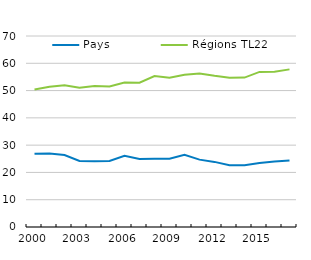
| Category | Pays | Régions TL22 |
|---|---|---|
| 2000.0 | 26.817 | 50.398 |
| 2001.0 | 26.947 | 51.413 |
| 2002.0 | 26.353 | 51.987 |
| 2003.0 | 24.17 | 51.062 |
| 2004.0 | 24.091 | 51.653 |
| 2005.0 | 24.175 | 51.518 |
| 2006.0 | 26.076 | 52.953 |
| 2007.0 | 24.936 | 52.872 |
| 2008.0 | 24.971 | 55.344 |
| 2009.0 | 25.018 | 54.701 |
| 2010.0 | 26.502 | 55.82 |
| 2011.0 | 24.689 | 56.273 |
| 2012.0 | 23.862 | 55.411 |
| 2013.0 | 22.643 | 54.733 |
| 2014.0 | 22.658 | 54.758 |
| 2015.0 | 23.422 | 56.844 |
| 2016.0 | 24.042 | 56.935 |
| 2017.0 | 24.379 | 57.77 |